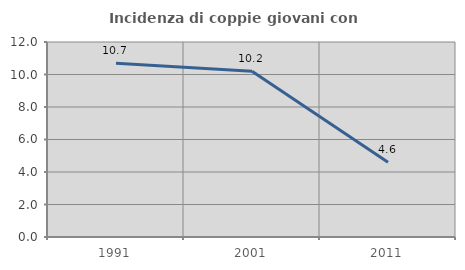
| Category | Incidenza di coppie giovani con figli |
|---|---|
| 1991.0 | 10.687 |
| 2001.0 | 10.196 |
| 2011.0 | 4.598 |